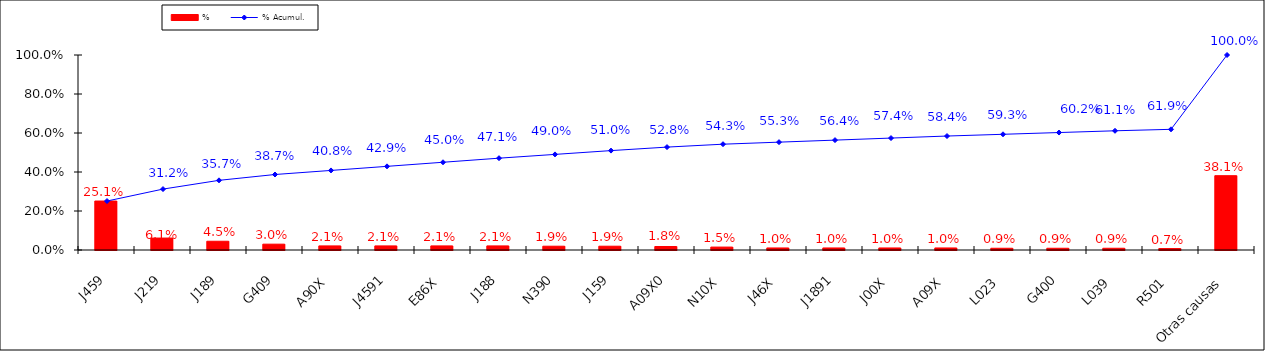
| Category | % |
|---|---|
| J459 | 0.251 |
| J219 | 0.061 |
| J189 | 0.045 |
| G409 | 0.03 |
| A90X | 0.021 |
| J4591 | 0.021 |
| E86X | 0.021 |
| J188 | 0.021 |
| N390 | 0.019 |
| J159 | 0.019 |
| A09X0 | 0.018 |
| N10X | 0.015 |
| J46X | 0.01 |
| J1891 | 0.01 |
| J00X | 0.01 |
| A09X | 0.01 |
| L023 | 0.009 |
| G400 | 0.009 |
| L039 | 0.009 |
| R501 | 0.007 |
| Otras causas | 0.381 |